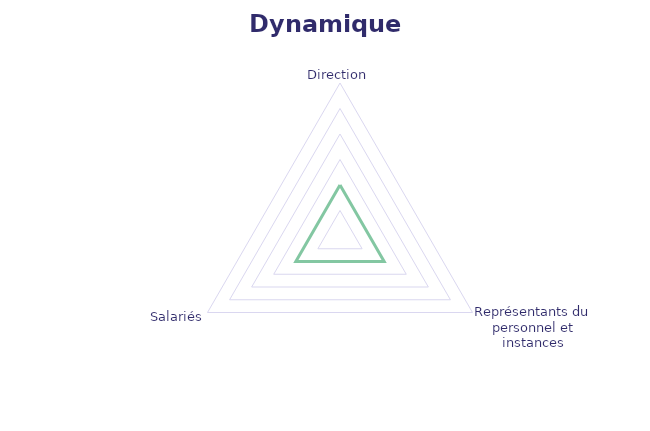
| Category | Series 0 |
|---|---|
| Direction | 0 |
| Représentants du personnel et instances | 0 |
| Salariés | 0 |